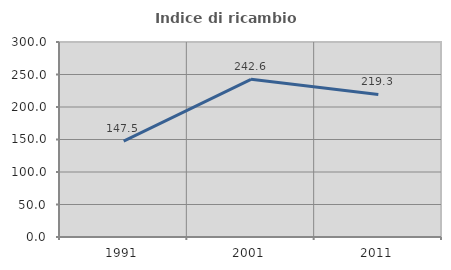
| Category | Indice di ricambio occupazionale  |
|---|---|
| 1991.0 | 147.541 |
| 2001.0 | 242.593 |
| 2011.0 | 219.277 |